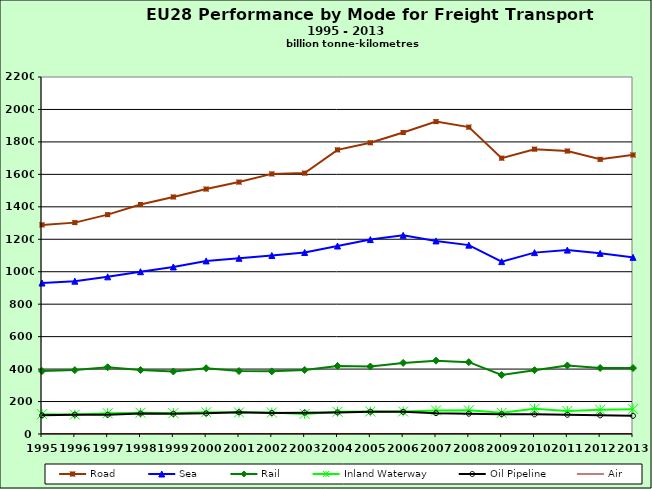
| Category | Road | Sea | Rail | Inland Waterway | Oil Pipeline | Air |
|---|---|---|---|---|---|---|
| 1995.0 | 1288.66 | 930.375 | 388.118 | 122.118 | 114.91 | 1.766 |
| 1996.0 | 1302.579 | 941.74 | 393.863 | 119.778 | 119.33 | 1.819 |
| 1997.0 | 1351.678 | 968.531 | 411.252 | 127.87 | 118.904 | 1.925 |
| 1998.0 | 1414.204 | 1000.193 | 394.338 | 131.064 | 126.34 | 1.987 |
| 1999.0 | 1460.622 | 1029.42 | 385.31 | 128.779 | 124.851 | 2.031 |
| 2000.0 | 1509.488 | 1066.765 | 405.464 | 133.925 | 127.107 | 2.164 |
| 2001.0 | 1552.517 | 1083.001 | 388.048 | 132.606 | 133.937 | 2.173 |
| 2002.0 | 1602.835 | 1100.05 | 385.983 | 132.594 | 129.732 | 2.12 |
| 2003.0 | 1607.683 | 1118.723 | 394.375 | 123.615 | 131.688 | 2.137 |
| 2004.0 | 1750.92 | 1158.503 | 419.326 | 136.913 | 133.259 | 2.217 |
| 2005.0 | 1794.595 | 1198.093 | 416.024 | 138.781 | 137.589 | 2.279 |
| 2006.0 | 1857.747 | 1224.412 | 438.165 | 138.577 | 136.566 | 2.349 |
| 2007.0 | 1924.958 | 1189.904 | 452 | 145.073 | 128.451 | 2.429 |
| 2008.0 | 1891.126 | 1163.916 | 442.763 | 146.129 | 124.945 | 2.385 |
| 2009.0 | 1699.757 | 1062.372 | 363.541 | 130.532 | 121.819 | 2.227 |
| 2010.0 | 1755.311 | 1117.777 | 393.531 | 155.521 | 121.133 | 2.313 |
| 2011.0 | 1743.854 | 1133.154 | 422.097 | 141.969 | 118.37 | 2.283 |
| 2012.0 | 1692.581 | 1113.126 | 406.671 | 149.987 | 114.897 | 2.265 |
| 2013.0 | 1719.448 | 1088.606 | 406.504 | 152.749 | 111.81 | 2.243 |